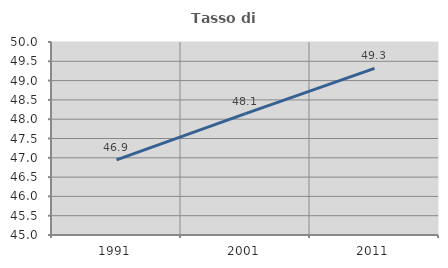
| Category | Tasso di occupazione   |
|---|---|
| 1991.0 | 46.945 |
| 2001.0 | 48.144 |
| 2011.0 | 49.318 |